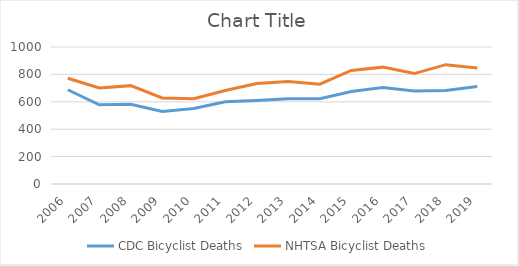
| Category | CDC Bicyclist Deaths | NHTSA Bicyclist Deaths |
|---|---|---|
| 2006.0 | 688 | 772 |
| 2007.0 | 578 | 701 |
| 2008.0 | 582 | 718 |
| 2009.0 | 529 | 628 |
| 2010.0 | 551 | 623 |
| 2011.0 | 601 | 682 |
| 2012.0 | 610 | 734 |
| 2013.0 | 623 | 749 |
| 2014.0 | 623 | 729 |
| 2015.0 | 675 | 829 |
| 2016.0 | 704 | 853 |
| 2017.0 | 679 | 806 |
| 2018.0 | 682 | 871 |
| 2019.0 | 712 | 846 |